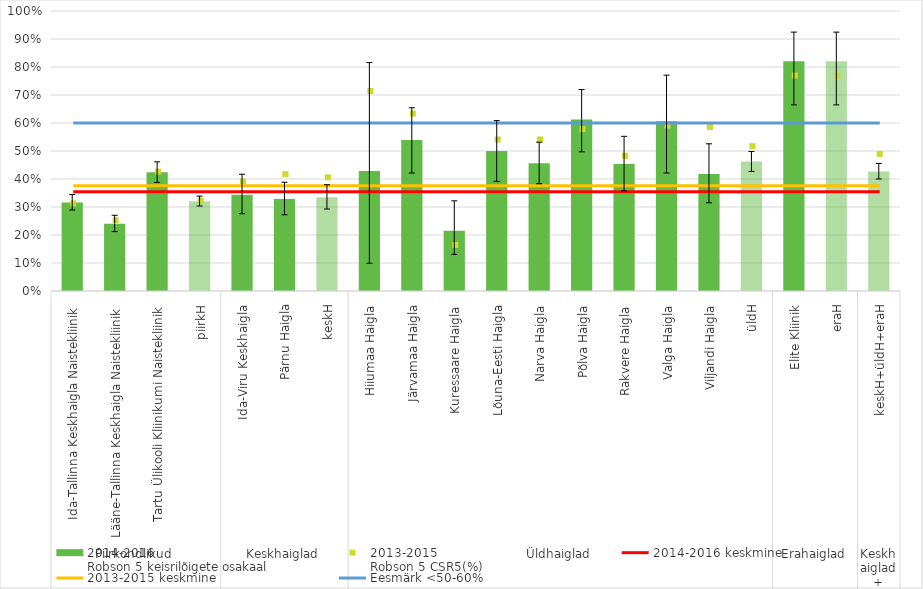
| Category | 2014-2016
Robson 5 keisrilõigete osakaal |
|---|---|
| 0 | 0.316 |
| 1 | 0.24 |
| 2 | 0.424 |
| 3 | 0.321 |
| 4 | 0.344 |
| 5 | 0.328 |
| 6 | 0.335 |
| 7 | 0.429 |
| 8 | 0.539 |
| 9 | 0.215 |
| 10 | 0.5 |
| 11 | 0.457 |
| 12 | 0.612 |
| 13 | 0.454 |
| 14 | 0.606 |
| 15 | 0.418 |
| 16 | 0.462 |
| 17 | 0.821 |
| 18 | 0.821 |
| 19 | 0.427 |